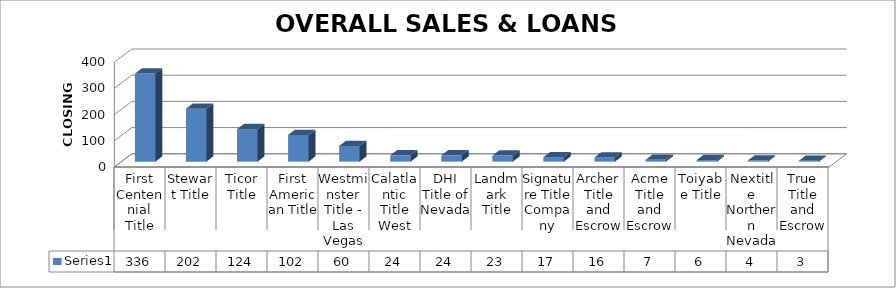
| Category | Series 0 |
|---|---|
| First Centennial Title | 336 |
| Stewart Title | 202 |
| Ticor Title | 124 |
| First American Title | 102 |
| Westminster Title - Las Vegas | 60 |
| Calatlantic Title West | 24 |
| DHI Title of Nevada | 24 |
| Landmark Title | 23 |
| Signature Title Company | 17 |
| Archer Title and Escrow | 16 |
| Acme Title and Escrow | 7 |
| Toiyabe Title | 6 |
| Nextitle Northern Nevada | 4 |
| True Title and Escrow | 3 |